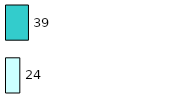
| Category | Series 0 | Series 1 |
|---|---|---|
| 0 | 24 | 39 |